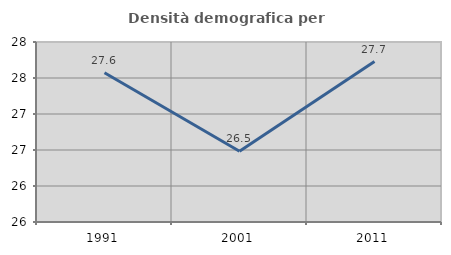
| Category | Densità demografica |
|---|---|
| 1991.0 | 27.573 |
| 2001.0 | 26.483 |
| 2011.0 | 27.729 |